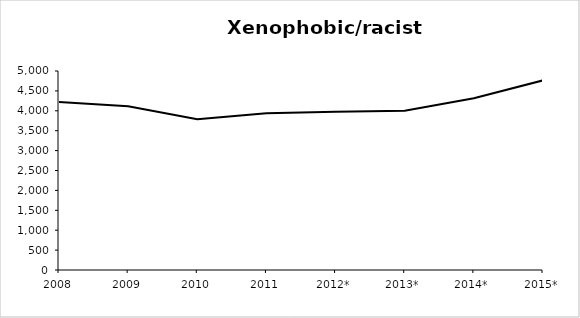
| Category | Series 0 |
|---|---|
| 2008 | 4224 |
| 2009 | 4116 |
| 2010 | 3786 |
| 2011 | 3936 |
| 2012* | 3978.837 |
| 2013* | 3999 |
| 2014* | 4314 |
| 2015* | 4765 |